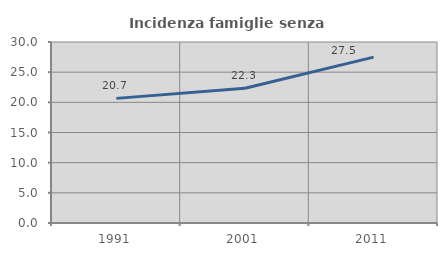
| Category | Incidenza famiglie senza nuclei |
|---|---|
| 1991.0 | 20.656 |
| 2001.0 | 22.343 |
| 2011.0 | 27.5 |